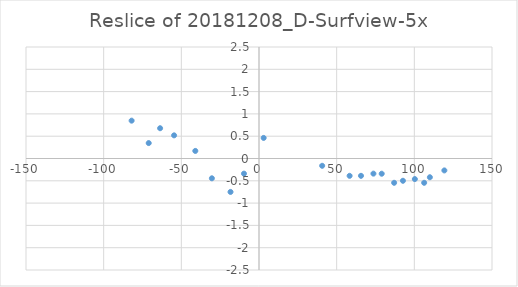
| Category | Reslice of 20181208_D-Surfview-5x |
|---|---|
| -18.333333333333332 | -0.75 |
| 87.0 | -0.545 |
| 106.33333333333333 | -0.545 |
| 92.66666666666667 | -0.499 |
| 100.33333333333333 | -0.461 |
| -30.333333333333332 | -0.444 |
| 110.0 | -0.42 |
| 58.333333333333336 | -0.388 |
| 65.66666666666667 | -0.388 |
| 79.0 | -0.341 |
| -9.666666666666666 | -0.339 |
| 73.66666666666667 | -0.339 |
| 119.33333333333333 | -0.267 |
| 40.666666666666664 | -0.163 |
| -41.0 | 0.17 |
| -71.0 | 0.346 |
| 3.0 | 0.461 |
| -54.666666666666664 | 0.519 |
| -63.666666666666664 | 0.679 |
| -82.0 | 0.848 |